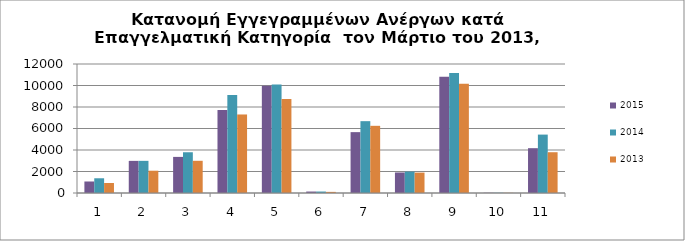
| Category | 2015 | 2014 | 2013 |
|---|---|---|---|
| 1.0 | 1071 | 1370 | 931 |
| 2.0 | 2988 | 2991 | 2073 |
| 3.0 | 3358 | 3790 | 2996 |
| 4.0 | 7719 | 9114 | 7305 |
| 5.0 | 9987 | 10084 | 8751 |
| 6.0 | 135 | 136 | 104 |
| 7.0 | 5662 | 6682 | 6249 |
| 8.0 | 1910 | 1992 | 1898 |
| 9.0 | 10813 | 11159 | 10168 |
| 10.0 | 21 | 21 | 15 |
| 11.0 | 4169 | 5433 | 3793 |